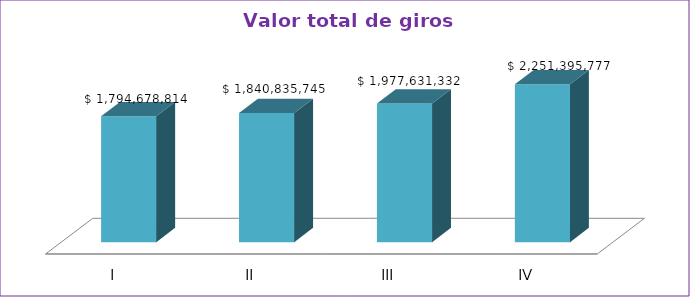
| Category | Series 0 |
|---|---|
| I | 1794678814 |
| II | 1840835745 |
| III | 1977631332 |
| IV | 2251395777 |